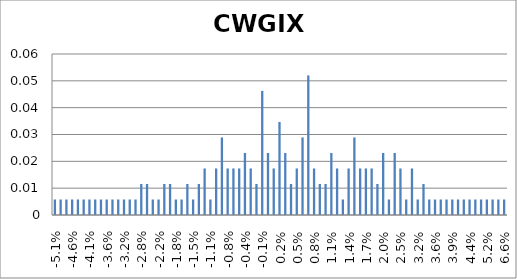
| Category | Series 0 |
|---|---|
| -0.051 | 0.006 |
| -0.049 | 0.006 |
| -0.047 | 0.006 |
| -0.046 | 0.006 |
| -0.045 | 0.006 |
| -0.043 | 0.006 |
| -0.041 | 0.006 |
| -0.04 | 0.006 |
| -0.039 | 0.006 |
| -0.036 | 0.006 |
| -0.034 | 0.006 |
| -0.033 | 0.006 |
| -0.032 | 0.006 |
| -0.031 | 0.006 |
| -0.03 | 0.006 |
| -0.028 | 0.012 |
| -0.025 | 0.012 |
| -0.024 | 0.006 |
| -0.022 | 0.006 |
| -0.021 | 0.012 |
| -0.019 | 0.012 |
| -0.018 | 0.006 |
| -0.017 | 0.006 |
| -0.016 | 0.012 |
| -0.015 | 0.006 |
| -0.013 | 0.012 |
| -0.012 | 0.017 |
| -0.011 | 0.006 |
| -0.01 | 0.017 |
| -0.009 | 0.029 |
| -0.008 | 0.017 |
| -0.007 | 0.017 |
| -0.005 | 0.017 |
| -0.004 | 0.023 |
| -0.003 | 0.017 |
| -0.002 | 0.012 |
| -0.001 | 0.046 |
| 0.0 | 0.023 |
| 0.001 | 0.017 |
| 0.002 | 0.035 |
| 0.003 | 0.023 |
| 0.004 | 0.012 |
| 0.005 | 0.017 |
| 0.006 | 0.029 |
| 0.007 | 0.052 |
| 0.008 | 0.017 |
| 0.009 | 0.012 |
| 0.01 | 0.012 |
| 0.011 | 0.023 |
| 0.012 | 0.017 |
| 0.013 | 0.006 |
| 0.014 | 0.017 |
| 0.015 | 0.029 |
| 0.016 | 0.017 |
| 0.017 | 0.017 |
| 0.018 | 0.017 |
| 0.019 | 0.012 |
| 0.02 | 0.023 |
| 0.022 | 0.006 |
| 0.023 | 0.023 |
| 0.025 | 0.017 |
| 0.027 | 0.006 |
| 0.031 | 0.017 |
| 0.032 | 0.006 |
| 0.033 | 0.012 |
| 0.035 | 0.006 |
| 0.036 | 0.006 |
| 0.037 | 0.006 |
| 0.038 | 0.006 |
| 0.039 | 0.006 |
| 0.04 | 0.006 |
| 0.041 | 0.006 |
| 0.044 | 0.006 |
| 0.045 | 0.006 |
| 0.05 | 0.006 |
| 0.052 | 0.006 |
| 0.054 | 0.006 |
| 0.058 | 0.006 |
| 0.066 | 0.006 |